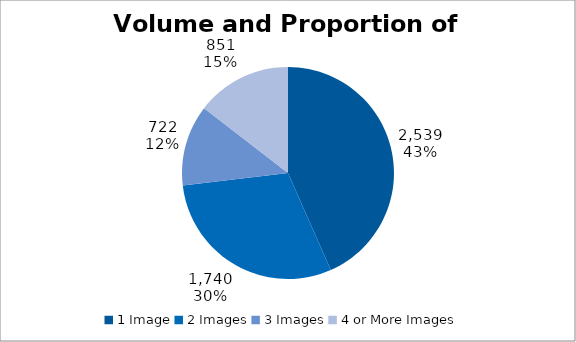
| Category | Total |
|---|---|
| 1 Image | 2539 |
| 2 Images | 1740 |
| 3 Images | 722 |
| 4 or More Images | 851 |